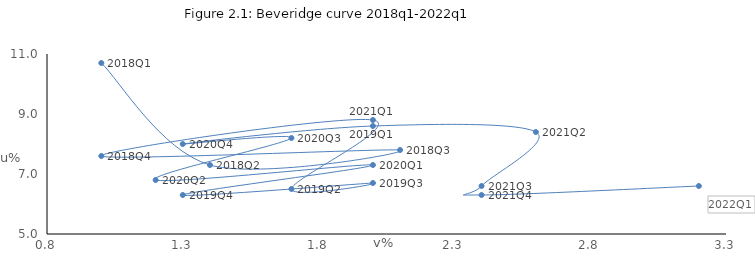
| Category | ΕΔ % ανεργίας |
|---|---|
| 1.0 | 10.7 |
| 1.4 | 7.3 |
| 2.1 | 7.8 |
| 1.0 | 7.6 |
| 2.0 | 8.8 |
| 1.7 | 6.5 |
| 2.0 | 6.7 |
| 1.3 | 6.3 |
| 2.0 | 7.3 |
| 1.2 | 6.8 |
| 1.7 | 8.2 |
| 1.3 | 8 |
| 2.0 | 8.6 |
| 2.6 | 8.4 |
| 2.4 | 6.6 |
| 2.4 | 6.3 |
| 3.2 | 6.6 |